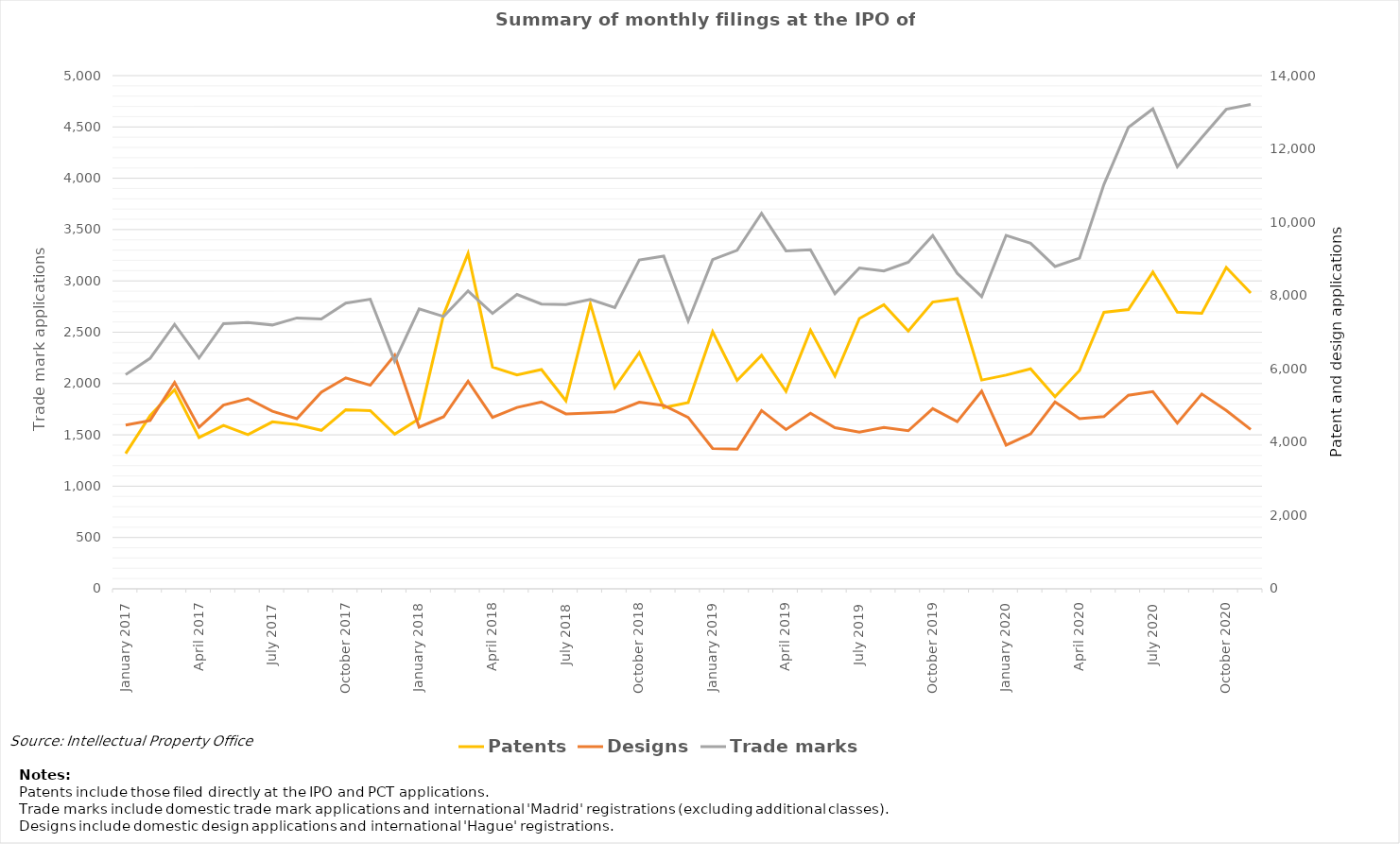
| Category | Patents | Designs |
|---|---|---|
| January 2017 | 1318 | 1596 |
| February 2017 | 1687 | 1640 |
| March 2017 | 1940 | 2011 |
| April 2017 | 1474 | 1573 |
| May 2017 | 1592 | 1790 |
| June 2017 | 1502 | 1853 |
| July 2017 | 1627 | 1730 |
| August 2017 | 1600 | 1657 |
| September 2017 | 1544 | 1915 |
| October 2017 | 1745 | 2055 |
| November 2017 | 1736 | 1983 |
| December 2017 | 1507 | 2277 |
| January 2018 | 1658 | 1575 |
| February 2018 | 2672 | 1676 |
| March 2018 | 3267 | 2022 |
| April 2018 | 2160 | 1670 |
| May 2018 | 2083 | 1767 |
| June 2018 | 2136 | 1821 |
| July 2018 | 1832 | 1704 |
| August 2018 | 2777 | 1713 |
| September 2018 | 1960 | 1725 |
| October 2018 | 2302 | 1818 |
| November 2018 | 1765 | 1787 |
| December 2018 | 1815 | 1670 |
| January 2019 | 2505 | 1367 |
| February 2019 | 2031 | 1361 |
| March 2019 | 2275 | 1737 |
| April 2019 | 1923 | 1552 |
| May 2019 | 2520 | 1710 |
| June 2019 | 2074 | 1570 |
| July 2019 | 2634 | 1527 |
| August 2019 | 2768 | 1572 |
| September 2019 | 2511 | 1540 |
| October 2019 | 2794 | 1755 |
| November 2019 | 2827 | 1629 |
| December 2019 | 2034 | 1927 |
| January 2020 | 2082 | 1400 |
| February 2020 | 2143 | 1509 |
| March 2020 | 1871 | 1820 |
| April 2020 | 2127 | 1658 |
| May 2020 | 2694 | 1678 |
| June 2020 | 2721 | 1886 |
| July 2020 | 3086 | 1921 |
| August 2020 | 2695 | 1614 |
| September 2020 | 2685 | 1898 |
| October 2020 | 3130 | 1738 |
| November 2020 | 2882 | 1553 |